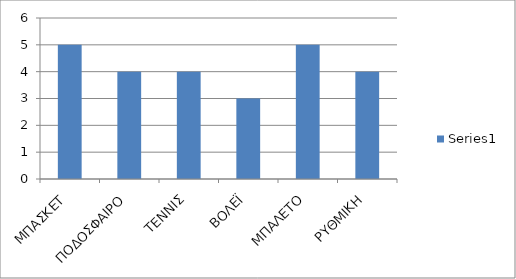
| Category | Series 0 |
|---|---|
| ΜΠΑΣΚΕΤ | 5 |
| ΠΟΔΟΣΦΑΙΡΟ | 4 |
| ΤΕΝΝΙΣ | 4 |
| ΒΟΛΕΪ | 3 |
| ΜΠΑΛΕΤΟ | 5 |
| ΡΥΘΜΙΚΗ | 4 |